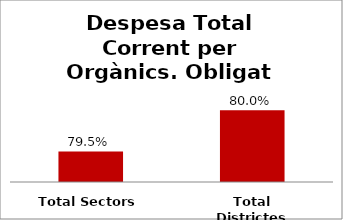
| Category | Series 0 |
|---|---|
| Total Sectors | 0.795 |
| Total Districtes | 0.8 |